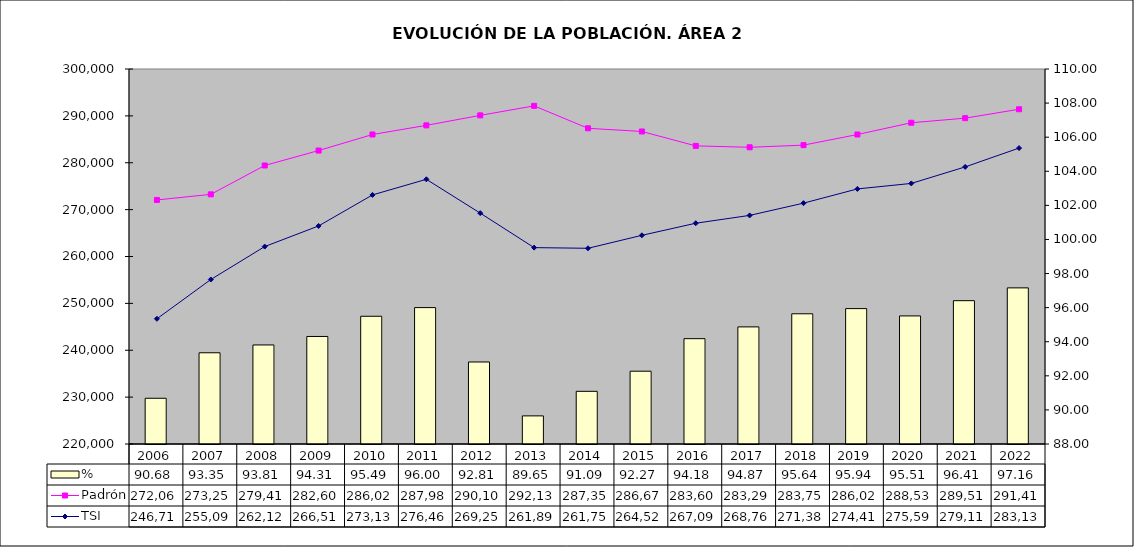
| Category | % |
|---|---|
| 2006.0 | 90.683 |
| 2007.0 | 93.352 |
| 2008.0 | 93.81 |
| 2009.0 | 94.308 |
| 2010.0 | 95.493 |
| 2011.0 | 96.003 |
| 2012.0 | 92.811 |
| 2013.0 | 89.649 |
| 2014.0 | 91.09 |
| 2015.0 | 92.27 |
| 2016.0 | 94.18 |
| 2017.0 | 94.87 |
| 2018.0 | 95.639 |
| 2019.0 | 95.943 |
| 2020.0 | 95.513 |
| 2021.0 | 96.408 |
| 2022.0 | 97.159 |